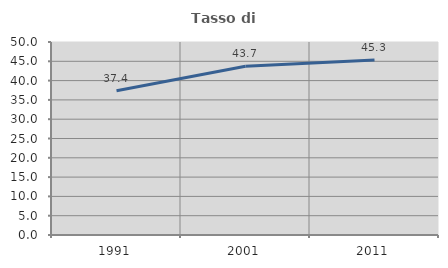
| Category | Tasso di occupazione   |
|---|---|
| 1991.0 | 37.371 |
| 2001.0 | 43.709 |
| 2011.0 | 45.338 |